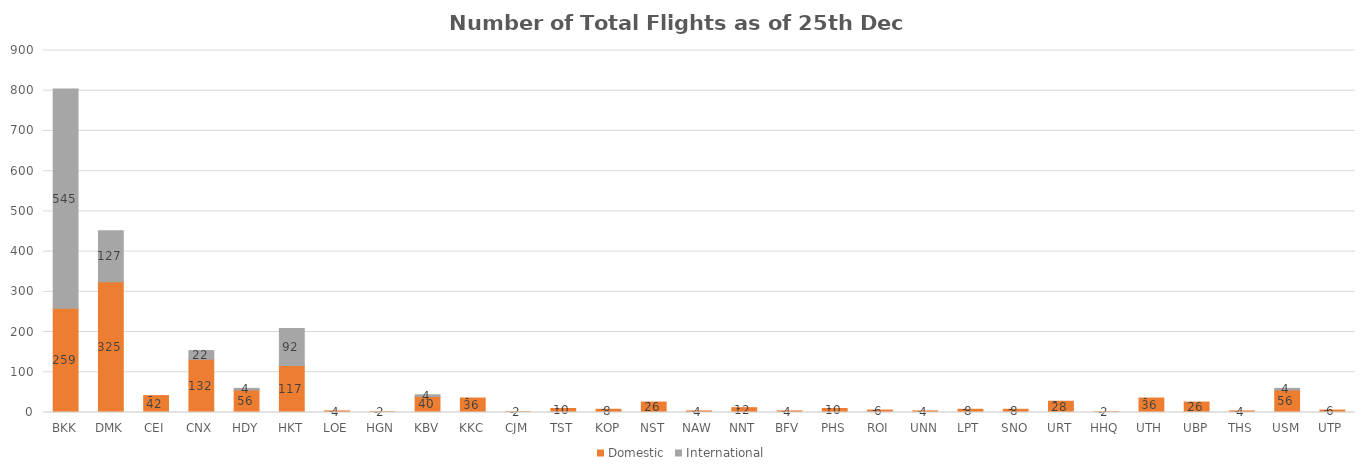
| Category | Domestic | International |
|---|---|---|
| BKK | 259 | 545 |
| DMK | 325 | 127 |
| CEI | 42 | 0 |
| CNX | 132 | 22 |
| HDY | 56 | 4 |
| HKT | 117 | 92 |
| LOE | 4 | 0 |
| HGN | 2 | 0 |
| KBV | 40 | 4 |
| KKC | 36 | 0 |
| CJM | 2 | 0 |
| TST | 10 | 0 |
| KOP | 8 | 0 |
| NST | 26 | 0 |
| NAW | 4 | 0 |
| NNT | 12 | 0 |
| BFV | 4 | 0 |
| PHS | 10 | 0 |
| ROI | 6 | 0 |
| UNN | 4 | 0 |
| LPT | 8 | 0 |
| SNO | 8 | 0 |
| URT | 28 | 0 |
| HHQ | 2 | 0 |
| UTH | 36 | 0 |
| UBP | 26 | 0 |
| THS | 4 | 0 |
| USM | 56 | 4 |
| UTP | 6 | 0 |